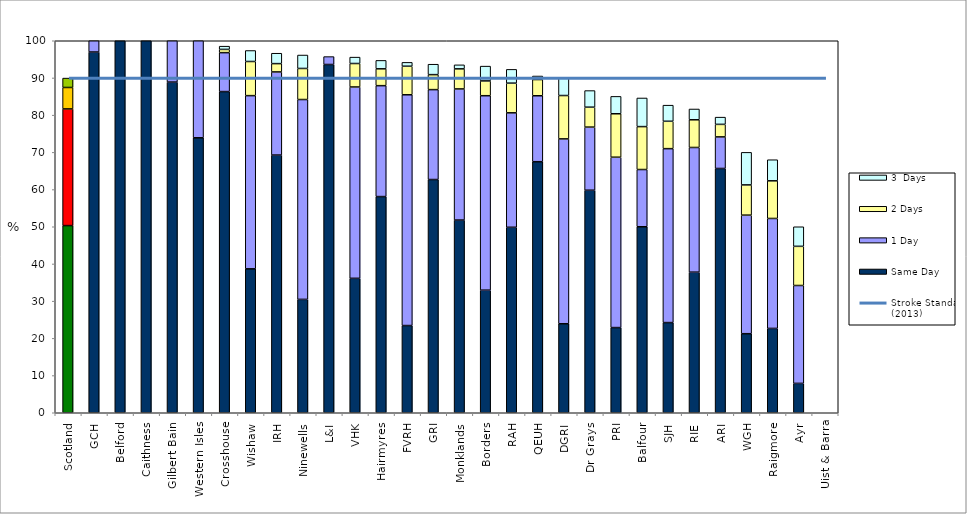
| Category | Same Day | 1 Day | 2 Days | 3  Days |
|---|---|---|---|---|
| Scotland | 50.313 | 31.362 | 5.763 | 2.525 |
| GCH | 96.97 | 3.03 | 0 | 0 |
| Belford | 100 | 0 | 0 | 0 |
| Caithness | 100 | 0 | 0 | 0 |
| Gilbert Bain | 88.889 | 11.111 | 0 | 0 |
| Western Isles | 73.913 | 26.087 | 0 | 0 |
| Crosshouse | 86.337 | 10.465 | 0.872 | 0.872 |
| Wishaw | 38.689 | 46.557 | 9.18 | 2.951 |
| IRH | 69.274 | 22.346 | 2.235 | 2.793 |
| Ninewells | 30.474 | 53.725 | 8.352 | 3.612 |
| L&I | 93.617 | 2.128 | 0 | 0 |
| VHK | 36.138 | 51.434 | 6.31 | 1.721 |
| Hairmyres | 58.113 | 29.811 | 4.528 | 2.264 |
| FVRH | 23.444 | 62.033 | 7.676 | 1.037 |
| GRI | 62.697 | 24.168 | 4.028 | 2.802 |
| Monklands | 51.799 | 35.252 | 5.396 | 1.079 |
| Borders | 32.955 | 52.273 | 3.977 | 3.977 |
| RAH | 49.858 | 30.769 | 7.977 | 3.704 |
| QEUH | 67.488 | 17.725 | 4.36 | 0.948 |
| DGRI | 23.926 | 49.693 | 11.656 | 4.908 |
| Dr Grays | 59.821 | 16.964 | 5.357 | 4.464 |
| PRI | 22.897 | 45.794 | 11.682 | 4.673 |
| Balfour | 50 | 15.385 | 11.538 | 7.692 |
| SJH | 24.242 | 46.753 | 7.359 | 4.329 |
| RIE | 37.793 | 33.517 | 7.448 | 2.897 |
| ARI | 65.664 | 8.496 | 3.363 | 1.947 |
| WGH | 21.25 | 31.875 | 8.125 | 8.75 |
| Raigmore | 22.672 | 29.555 | 10.121 | 5.668 |
| Ayr | 7.895 | 26.316 | 10.526 | 5.263 |
| Uist & Barra | 0 | 0 | 0 | 0 |